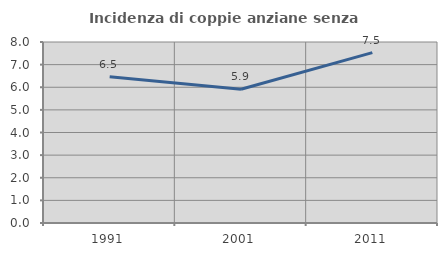
| Category | Incidenza di coppie anziane senza figli  |
|---|---|
| 1991.0 | 6.462 |
| 2001.0 | 5.913 |
| 2011.0 | 7.531 |